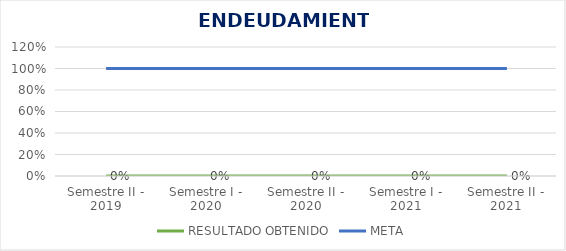
| Category | RESULTADO OBTENIDO | META |
|---|---|---|
| Semestre II - 2019 | 0 | 1 |
| Semestre I - 2020 | 0 | 1 |
| Semestre II - 2020 | 0 | 1 |
| Semestre I - 2021 | 0 | 1 |
| Semestre II - 2021 | 0 | 1 |